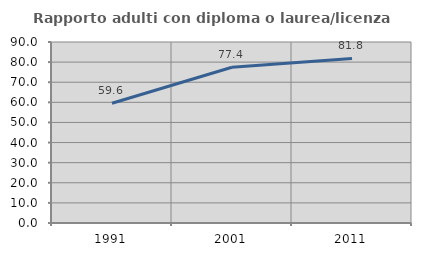
| Category | Rapporto adulti con diploma o laurea/licenza media  |
|---|---|
| 1991.0 | 59.574 |
| 2001.0 | 77.419 |
| 2011.0 | 81.818 |